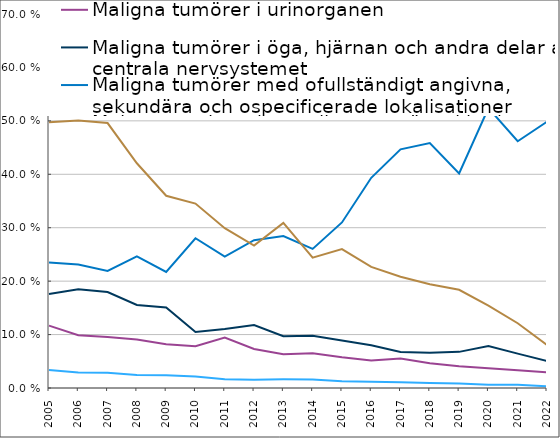
| Category | Maligna tumörer i urinorganen | Maligna tumörer i öga, hjärnan och andra delar av centrala nervsystemet | Maligna tumörer med ofullständigt angivna, sekundära och ospecificerade lokalisationer | Melanom och andra maligna tumörer i huden | Tumörer av osäker eller okänd natur |
|---|---|---|---|---|---|
| 2005.0 | 0.117 | 0.176 | 0.235 | 0.034 | 0.498 |
| 2006.0 | 0.099 | 0.185 | 0.231 | 0.029 | 0.501 |
| 2007.0 | 0.095 | 0.18 | 0.219 | 0.028 | 0.496 |
| 2008.0 | 0.091 | 0.155 | 0.246 | 0.024 | 0.421 |
| 2009.0 | 0.082 | 0.151 | 0.217 | 0.024 | 0.36 |
| 2010.0 | 0.078 | 0.105 | 0.28 | 0.021 | 0.345 |
| 2011.0 | 0.095 | 0.11 | 0.246 | 0.017 | 0.299 |
| 2012.0 | 0.073 | 0.118 | 0.277 | 0.016 | 0.267 |
| 2013.0 | 0.063 | 0.097 | 0.284 | 0.016 | 0.309 |
| 2014.0 | 0.065 | 0.098 | 0.26 | 0.016 | 0.244 |
| 2015.0 | 0.058 | 0.089 | 0.31 | 0.013 | 0.26 |
| 2016.0 | 0.051 | 0.08 | 0.393 | 0.012 | 0.227 |
| 2017.0 | 0.055 | 0.068 | 0.447 | 0.011 | 0.208 |
| 2018.0 | 0.046 | 0.066 | 0.458 | 0.01 | 0.194 |
| 2019.0 | 0.041 | 0.068 | 0.402 | 0.009 | 0.184 |
| 2020.0 | 0.037 | 0.079 | 0.524 | 0.006 | 0.154 |
| 2021.0 | 0.033 | 0.064 | 0.462 | 0.006 | 0.121 |
| 2022.0 | 0.03 | 0.05 | 0.498 | 0.003 | 0.08 |